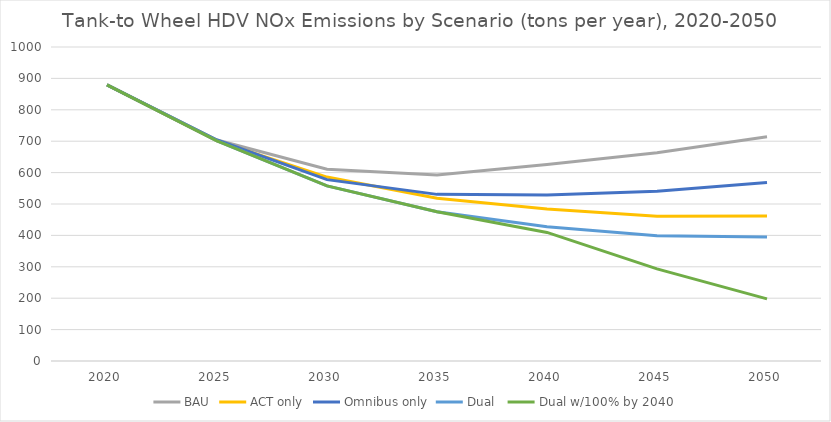
| Category | BAU | ACT only | Omnibus only | Dual  | Dual w/100% by 2040 |
|---|---|---|---|---|---|
| 2020.0 | 879.221 | 879.221 | 879.221 | 879.221 | 879.221 |
| 2025.0 | 703.837 | 701.236 | 703.837 | 701.236 | 701.236 |
| 2030.0 | 610.458 | 585.722 | 577.619 | 557.609 | 557.609 |
| 2035.0 | 592.09 | 518.26 | 530.667 | 475.099 | 475.099 |
| 2040.0 | 625.612 | 484.225 | 528.997 | 427.333 | 409.542 |
| 2045.0 | 663.483 | 461.171 | 540.229 | 398.982 | 293.198 |
| 2050.0 | 714.424 | 461.602 | 568.232 | 395.112 | 197.804 |